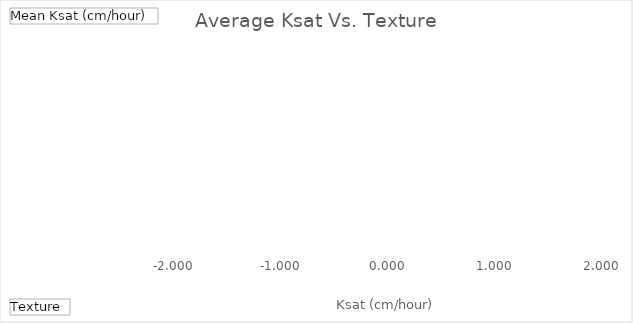
| Category | Total |
|---|---|
| silty clay loam | 0.083 |
| silty clay   | 0.448 |
| sandy loam/silt loam | 1.155 |
| sandy loam - loamy sand | 9.422 |
| sandy loam   | 7.164 |
| sand | 15.211 |
| loamy sand | 21.356 |
| loamy fine sand | 14.19 |
| loam   | 0.888 |
| clay loam - loam | 1.096 |